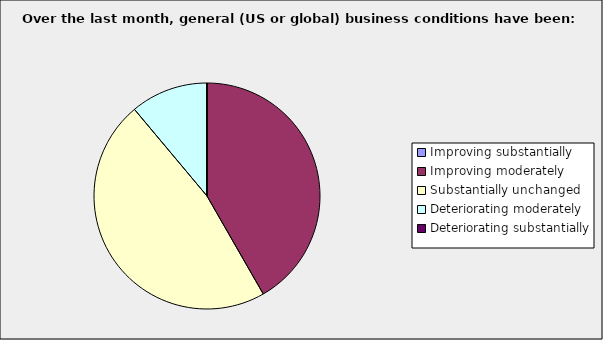
| Category | Series 0 |
|---|---|
| Improving substantially | 0 |
| Improving moderately | 0.417 |
| Substantially unchanged | 0.472 |
| Deteriorating moderately | 0.111 |
| Deteriorating substantially | 0 |